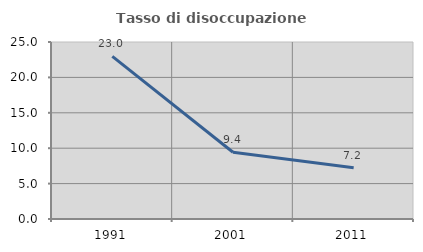
| Category | Tasso di disoccupazione giovanile  |
|---|---|
| 1991.0 | 22.973 |
| 2001.0 | 9.424 |
| 2011.0 | 7.237 |